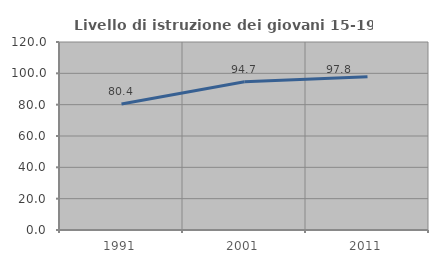
| Category | Livello di istruzione dei giovani 15-19 anni |
|---|---|
| 1991.0 | 80.402 |
| 2001.0 | 94.684 |
| 2011.0 | 97.818 |